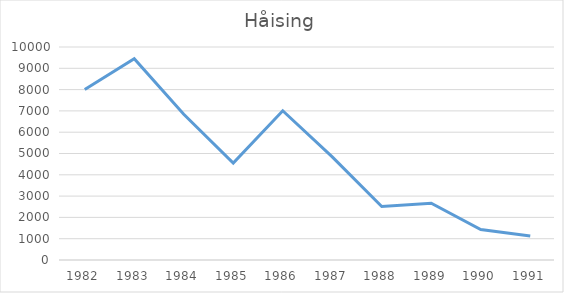
| Category | Series 0 |
|---|---|
| 1982.0 | 8007 |
| 1983.0 | 9446 |
| 1984.0 | 6843 |
| 1985.0 | 4553 |
| 1986.0 | 7006 |
| 1987.0 | 4843 |
| 1988.0 | 2512 |
| 1989.0 | 2664 |
| 1990.0 | 1434 |
| 1991.0 | 1124 |